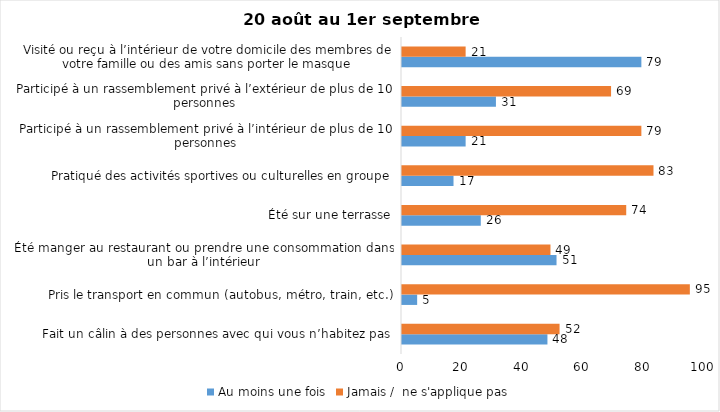
| Category | Au moins une fois | Jamais /  ne s'applique pas |
|---|---|---|
| Fait un câlin à des personnes avec qui vous n’habitez pas | 48 | 52 |
| Pris le transport en commun (autobus, métro, train, etc.) | 5 | 95 |
| Été manger au restaurant ou prendre une consommation dans un bar à l’intérieur | 51 | 49 |
| Été sur une terrasse | 26 | 74 |
| Pratiqué des activités sportives ou culturelles en groupe | 17 | 83 |
| Participé à un rassemblement privé à l’intérieur de plus de 10 personnes | 21 | 79 |
| Participé à un rassemblement privé à l’extérieur de plus de 10 personnes | 31 | 69 |
| Visité ou reçu à l’intérieur de votre domicile des membres de votre famille ou des amis sans porter le masque | 79 | 21 |